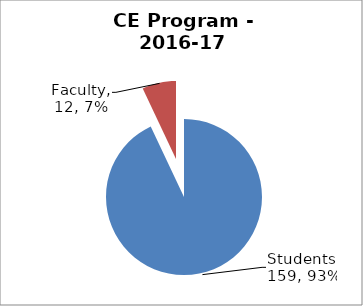
| Category | Series 0 |
|---|---|
| Students | 159 |
| Faculty | 12 |